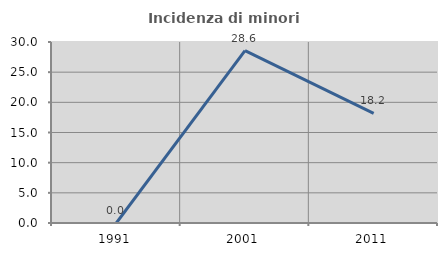
| Category | Incidenza di minori stranieri |
|---|---|
| 1991.0 | 0 |
| 2001.0 | 28.571 |
| 2011.0 | 18.182 |